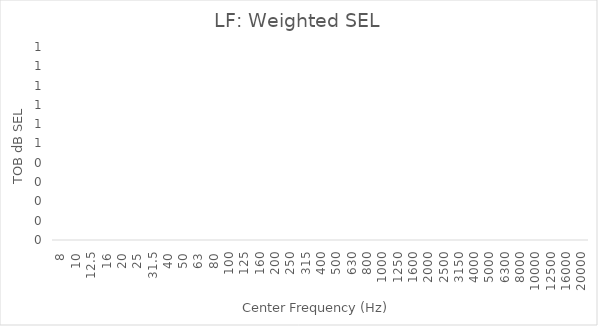
| Category | Series 0 |
|---|---|
| 8.0 | 0 |
| 10.0 | 0 |
| 12.5 | 0 |
| 16.0 | 0 |
| 20.0 | 0 |
| 25.0 | 0 |
| 31.5 | 0 |
| 40.0 | 0 |
| 50.0 | 0 |
| 63.0 | 0 |
| 80.0 | 0 |
| 100.0 | 0 |
| 125.0 | 0 |
| 160.0 | 0 |
| 200.0 | 0 |
| 250.0 | 0 |
| 315.0 | 0 |
| 400.0 | 0 |
| 500.0 | 0 |
| 630.0 | 0 |
| 800.0 | 0 |
| 1000.0 | 0 |
| 1250.0 | 0 |
| 1600.0 | 0 |
| 2000.0 | 0 |
| 2500.0 | 0 |
| 3150.0 | 0 |
| 4000.0 | 0 |
| 5000.0 | 0 |
| 6300.0 | 0 |
| 8000.0 | 0 |
| 10000.0 | 0 |
| 12500.0 | 0 |
| 16000.0 | 0 |
| 20000.0 | 0 |